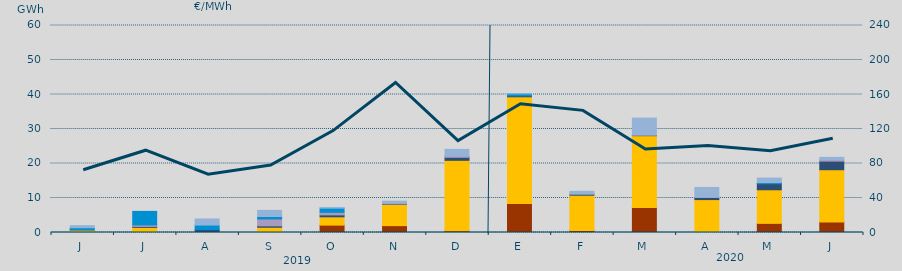
| Category | Carbón | Ciclo Combinado | Cogeneración | Consumo Bombeo | Enlace Península Baleares | Eólica | Hidráulica | Turbinación bombeo |
|---|---|---|---|---|---|---|---|---|
| J | 0 | 740 | 0 | 46.8 | 0.2 | 0 | 591.6 | 608.6 |
| J | 0 | 1487.2 | 0 | 278 | 427 | 0 | 3925.5 | 0 |
| A | 0 | 3 | 0 | 860.8 | 0 | 0 | 1293.4 | 1772.4 |
| S | 0 | 1521.8 | 0 | 407.7 | 1996.9 | 0 | 704.6 | 1776.1 |
| O | 2142 | 2403.7 | 0 | 557.8 | 729 | 0 | 1220 | 154.4 |
| N | 1990 | 6178.7 | 0 | 123 | 256 | 0 | 0 | 528.8 |
| D | 480 | 20442.6 | 0 | 860.7 | 364.9 | 0 | 0 | 1941.3 |
| E | 8420 | 30910.7 | 0 | 268 | 0 | 0 | 577.4 | 42.2 |
| F | 555 | 10252.6 | 0 | 288.2 | 0 | 0 | 0 | 841.9 |
| M | 7260 | 20800.5 | 0 | 100 | 224 | 0 | 0 | 4781.4 |
| A | 0 | 9541.3 | 0 | 636 | 60 | 0 | 0 | 2816.9 |
| M | 2649.6 | 9736.2 | 0 | 1745.1 | 0 | 0 | 334.1 | 1316.2 |
| J | 3060 | 15134.9 | 0 | 2490.7 | 411.1 | 0 | 0 | 685.4 |